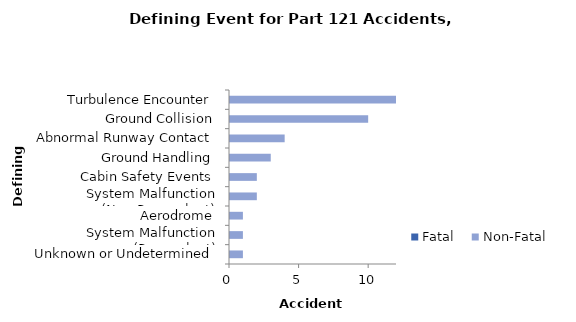
| Category | Fatal | Non-Fatal |
|---|---|---|
| Turbulence Encounter | 0 | 12 |
| Ground Collision | 0 | 10 |
| Abnormal Runway Contact | 0 | 4 |
| Ground Handling | 0 | 3 |
| Cabin Safety Events | 0 | 2 |
| System Malfunction (Non-Powerplant) | 0 | 2 |
| Aerodrome | 0 | 1 |
| System Malfunction (Powerplant) | 0 | 1 |
| Unknown or Undetermined | 0 | 1 |